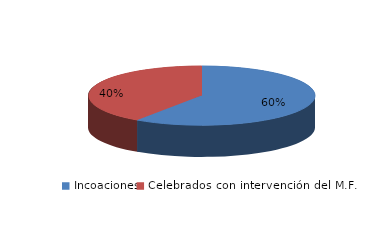
| Category | Series 0 |
|---|---|
| Incoaciones | 2787 |
| Celebrados con intervención del M.F. | 1892 |